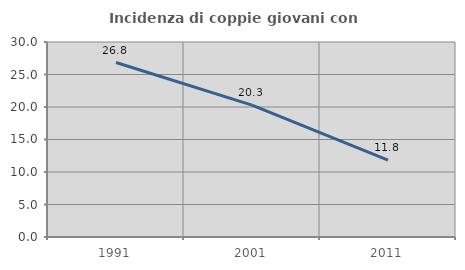
| Category | Incidenza di coppie giovani con figli |
|---|---|
| 1991.0 | 26.845 |
| 2001.0 | 20.285 |
| 2011.0 | 11.814 |